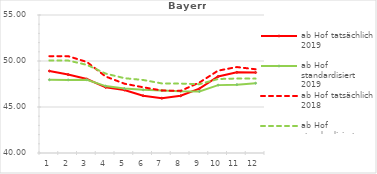
| Category | ab Hof tatsächlich 2019 | ab Hof standardisiert 2019 | ab Hof tatsächlich 2018 | ab Hof standardisiert 2018 |
|---|---|---|---|---|
| 0 | 48.911 | 47.961 | 50.521 | 50.058 |
| 1 | 48.522 | 47.944 | 50.524 | 50.051 |
| 2 | 48.036 | 47.957 | 49.895 | 49.581 |
| 3 | 47.137 | 47.274 | 48.316 | 48.635 |
| 4 | 46.851 | 47.006 | 47.536 | 48.132 |
| 5 | 46.228 | 46.862 | 47.144 | 47.938 |
| 6 | 45.959 | 46.787 | 46.793 | 47.563 |
| 7 | 46.221 | 46.701 | 46.752 | 47.546 |
| 8 | 46.991 | 46.692 | 47.657 | 47.482 |
| 9 | 48.312 | 47.378 | 48.954 | 48.042 |
| 10 | 48.767 | 47.432 | 49.342 | 48.096 |
| 11 | 48.749 | 47.586 | 49.101 | 48.084 |